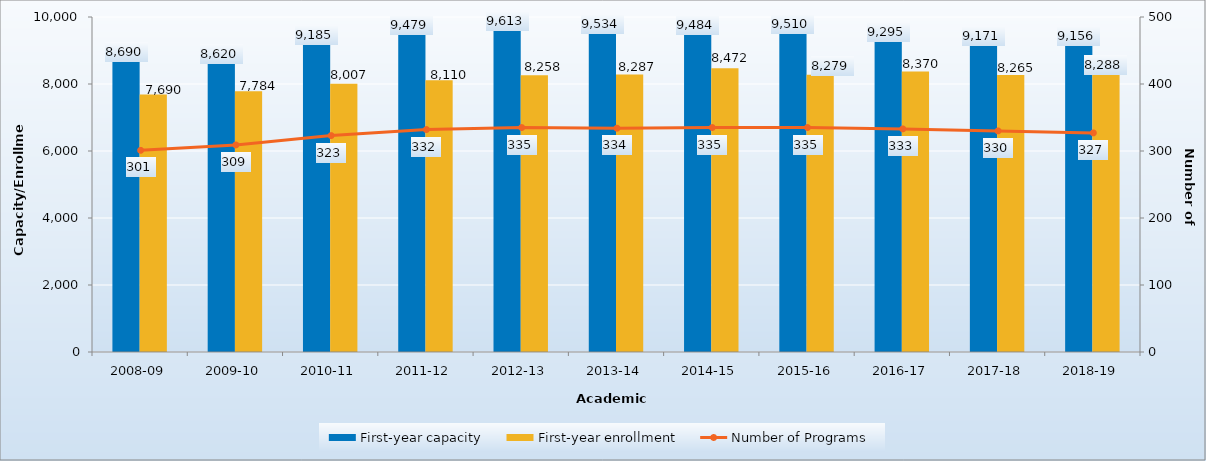
| Category | First-year capacity | First-year enrollment |
|---|---|---|
| 2008-09 | 8690 | 7690 |
| 2009-10 | 8620 | 7784 |
| 2010-11 | 9185 | 8007 |
| 2011-12 | 9479 | 8110 |
| 2012-13 | 9613 | 8258 |
| 2013-14 | 9534 | 8287 |
| 2014-15 | 9484 | 8472 |
| 2015-16 | 9510 | 8279 |
| 2016-17 | 9295 | 8370 |
| 2017-18 | 9171 | 8265 |
| 2018-19 | 9156 | 8288 |